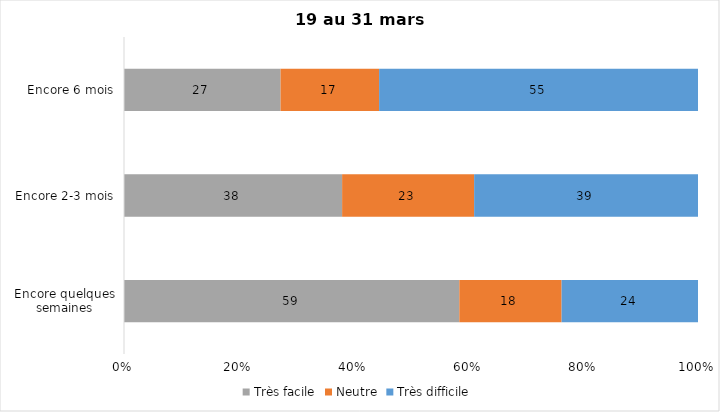
| Category | Très facile | Neutre | Très difficile |
|---|---|---|---|
| Encore quelques semaines | 59 | 18 | 24 |
| Encore 2-3 mois | 38 | 23 | 39 |
| Encore 6 mois | 27 | 17 | 55 |